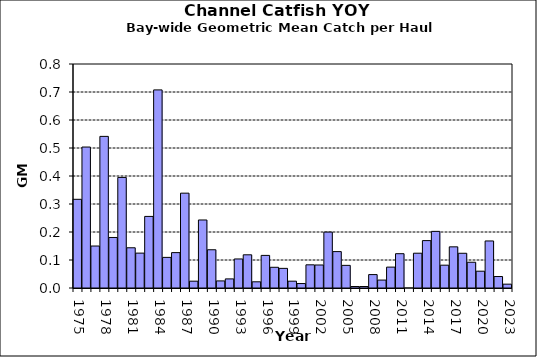
| Category | Series 0 |
|---|---|
| 1975.0 | 0.317 |
| 1976.0 | 0.503 |
| 1977.0 | 0.15 |
| 1978.0 | 0.541 |
| 1979.0 | 0.18 |
| 1980.0 | 0.395 |
| 1981.0 | 0.144 |
| 1982.0 | 0.125 |
| 1983.0 | 0.256 |
| 1984.0 | 0.708 |
| 1985.0 | 0.109 |
| 1986.0 | 0.126 |
| 1987.0 | 0.339 |
| 1988.0 | 0.024 |
| 1989.0 | 0.243 |
| 1990.0 | 0.137 |
| 1991.0 | 0.025 |
| 1992.0 | 0.032 |
| 1993.0 | 0.104 |
| 1994.0 | 0.119 |
| 1995.0 | 0.022 |
| 1996.0 | 0.116 |
| 1997.0 | 0.074 |
| 1998.0 | 0.07 |
| 1999.0 | 0.024 |
| 2000.0 | 0.016 |
| 2001.0 | 0.083 |
| 2002.0 | 0.082 |
| 2003.0 | 0.2 |
| 2004.0 | 0.13 |
| 2005.0 | 0.081 |
| 2006.0 | 0.005 |
| 2007.0 | 0.005 |
| 2008.0 | 0.048 |
| 2009.0 | 0.028 |
| 2010.0 | 0.075 |
| 2011.0 | 0.123 |
| 2012.0 | 0 |
| 2013.0 | 0.124 |
| 2014.0 | 0.169 |
| 2015.0 | 0.202 |
| 2016.0 | 0.082 |
| 2017.0 | 0.147 |
| 2018.0 | 0.124 |
| 2019.0 | 0.092 |
| 2020.0 | 0.06 |
| 2021.0 | 0.168 |
| 2022.0 | 0.041 |
| 2023.0 | 0.014 |